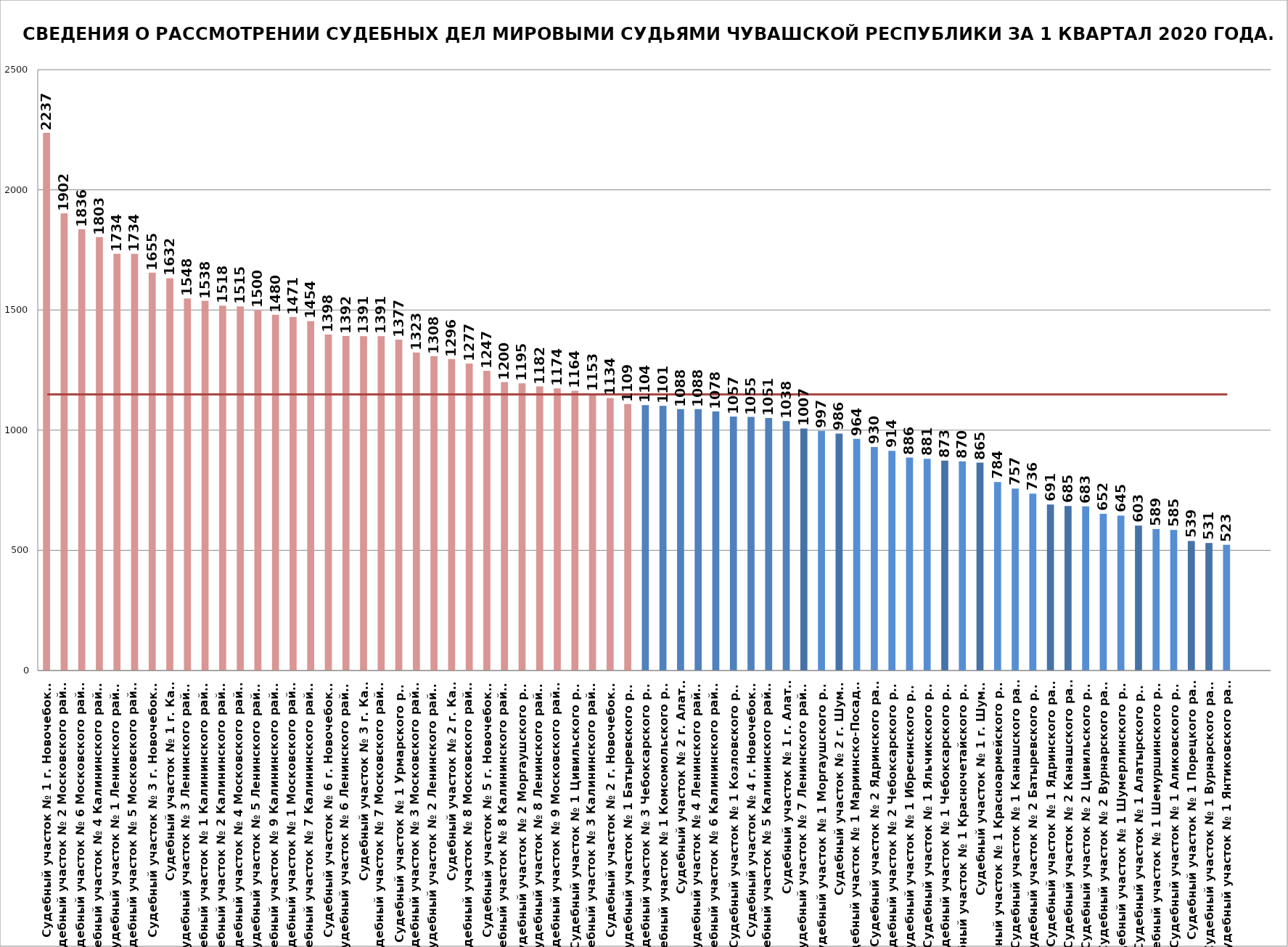
| Category | Общее кол-во рассмотренных дел |
|---|---|
| Судебный участок № 1 г. Новочебоксарск | 2237 |
| Судебный участок № 2 Московского района г. Чебоксары | 1902 |
| Судебный участок № 6 Московского района г. Чебоксары | 1836 |
| Судебный участок № 4 Калининского района г. Чебоксары | 1803 |
| Судебный участок № 1 Ленинского района г. Чебоксары | 1734 |
| Судебный участок № 5 Московского района г. Чебоксары | 1734 |
| Судебный участок № 3 г. Новочебоксарск | 1655 |
| Судебный участок № 1 г. Канаш | 1632 |
| Судебный участок № 3 Ленинского района г. Чебоксары | 1548 |
| Судебный участок № 1 Калининского района г. Чебоксары | 1538 |
| Судебный участок № 2 Калининского района г. Чебоксары | 1518 |
| Судебный участок № 4 Московского района г. Чебоксары | 1515 |
| Судебный участок № 5 Ленинского района г. Чебоксары | 1500 |
| Судебный участок № 9 Калининского района г. Чебоксары | 1480 |
| Судебный участок № 1 Московского района г. Чебоксары | 1471 |
| Судебный участок № 7 Калининского района г. Чебоксары | 1454 |
| Судебный участок № 6 г. Новочебоксарск | 1398 |
| Судебный участок № 6 Ленинского района г. Чебоксары | 1392 |
| Судебный участок № 3 г. Канаш | 1391 |
| Судебный участок № 7 Московского района г. Чебоксары | 1391 |
| Судебный участок № 1 Урмарского района | 1377 |
| Судебный участок № 3 Московского района г. Чебоксары | 1323 |
| Судебный участок № 2 Ленинского района г. Чебоксары | 1308 |
| Судебный участок № 2 г. Канаш | 1296 |
| Судебный участок № 8 Московского района г. Чебоксары | 1277 |
| Судебный участок № 5 г. Новочебоксарск | 1247 |
| Судебный участок № 8 Калининского района г. Чебоксары | 1200 |
| Судебный участок № 2 Моргаушского района | 1195 |
| Судебный участок № 8 Ленинского района г. Чебоксары | 1182 |
| Судебный участок № 9 Московского района г. Чебоксары | 1174 |
| Судебный участок № 1 Цивильского района | 1164 |
| Судебный участок № 3 Калининского района г. Чебоксары | 1153 |
| Судебный участок № 2 г. Новочебоксарск | 1134 |
| Судебный участок № 1 Батыревского района | 1109 |
| Судебный участок № 3 Чебоксарского района | 1104 |
| Судебный участок № 1 Комсомольского района | 1101 |
| Судебный участок № 2 г. Алатырь | 1088 |
| Судебный участок № 4 Ленинского района г. Чебоксары | 1088 |
| Судебный участок № 6 Калининского района г. Чебоксары | 1078 |
| Судебный участок № 1 Козловского района | 1057 |
| Судебный участок № 4 г. Новочебоксарск | 1055 |
| Судебный участок № 5 Калининского района г. Чебоксары | 1051 |
| Судебный участок № 1 г. Алатырь | 1038 |
| Судебный участок № 7 Ленинского района г. Чебоксары | 1007 |
| Судебный участок № 1 Моргаушского района | 997 |
| Судебный участок № 2 г. Шумерля | 986 |
| Судебный участок № 1 Мариинско-Посадского района | 964 |
| Судебный участок № 2 Ядринского района | 930 |
| Судебный участок № 2 Чебоксарского района | 914 |
| Судебный участок № 1 Ибресинского района | 886 |
| Судебный участок № 1 Яльчикского района | 881 |
| Судебный участок № 1 Чебоксарского района | 873 |
| Судебный участок № 1 Красночетайского района | 870 |
| Судебный участок № 1 г. Шумерля | 865 |
| Судебный участок № 1 Красноармейского района | 784 |
| Судебный участок № 1 Канашского района | 757 |
| Судебный участок № 2 Батыревского района | 736 |
| Судебный участок № 1 Ядринского района | 691 |
| Судебный участок № 2 Канашского района | 685 |
| Судебный участок № 2 Цивильского района | 683 |
| Судебный участок № 2 Вурнарского района | 652 |
| Судебный участок № 1 Шумерлинского района | 645 |
| Судебный участок № 1 Алатырского района | 603 |
| Судебный участок № 1 Шемуршинского района | 589 |
| Судебный участок № 1 Аликовского района | 585 |
| Судебный участок № 1 Порецкого района | 539 |
| Судебный участок № 1 Вурнарского района | 531 |
| Судебный участок № 1 Янтиковского района | 523 |